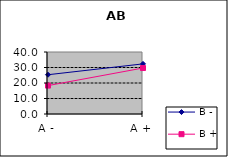
| Category | B - | B + |
|---|---|---|
| A - | 25.333 | 18.333 |
| A + | 32.333 | 29.667 |